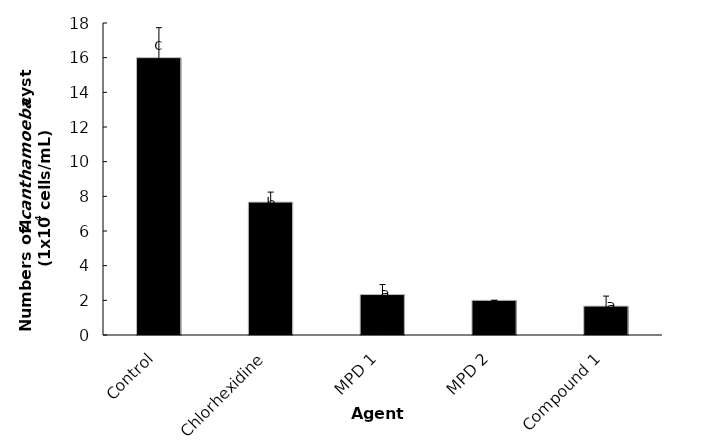
| Category | Series 0 |
|---|---|
| Control | 16 |
| Chlorhexidine | 7.667 |
| MPD 1 | 2.333 |
| MPD 2 | 2 |
| Compound 1 | 1.667 |